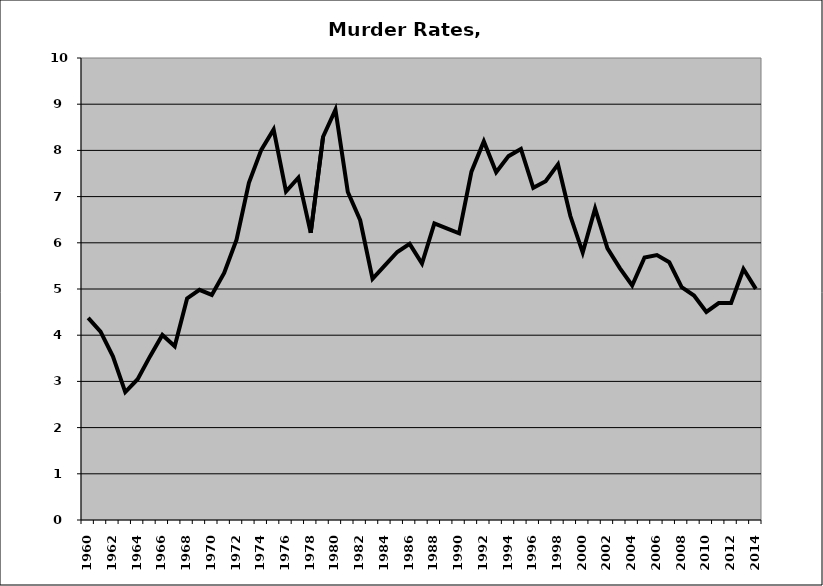
| Category | Murder |
|---|---|
| 1960.0 | 4.375 |
| 1961.0 | 4.076 |
| 1962.0 | 3.542 |
| 1963.0 | 2.769 |
| 1964.0 | 3.047 |
| 1965.0 | 3.541 |
| 1966.0 | 4.006 |
| 1967.0 | 3.76 |
| 1968.0 | 4.796 |
| 1969.0 | 4.982 |
| 1970.0 | 4.871 |
| 1971.0 | 5.347 |
| 1972.0 | 6.067 |
| 1973.0 | 7.299 |
| 1974.0 | 8.011 |
| 1975.0 | 8.454 |
| 1976.0 | 7.111 |
| 1977.0 | 7.411 |
| 1978.0 | 6.215 |
| 1979.0 | 8.296 |
| 1980.0 | 8.881 |
| 1981.0 | 7.098 |
| 1982.0 | 6.489 |
| 1983.0 | 5.22 |
| 1984.0 | 5.511 |
| 1985.0 | 5.801 |
| 1986.0 | 5.977 |
| 1987.0 | 5.551 |
| 1988.0 | 6.422 |
| 1989.0 | 6.311 |
| 1990.0 | 6.205 |
| 1991.0 | 7.54 |
| 1992.0 | 8.195 |
| 1993.0 | 7.527 |
| 1994.0 | 7.876 |
| 1995.0 | 8.03 |
| 1996.0 | 7.191 |
| 1997.0 | 7.333 |
| 1998.0 | 7.696 |
| 1999.0 | 6.579 |
| 2000.0 | 5.789 |
| 2001.0 | 6.741 |
| 2002.0 | 5.88 |
| 2003.0 | 5.452 |
| 2004.0 | 5.075 |
| 2005.0 | 5.681 |
| 2006.0 | 5.734 |
| 2007.0 | 5.579 |
| 2008.0 | 5.04 |
| 2009.0 | 4.857 |
| 2010.0 | 4.504 |
| 2011.0 | 4.696 |
| 2012.0 | 4.696 |
| 2013.0 | 5.433 |
| 2014.0 | 5.002 |